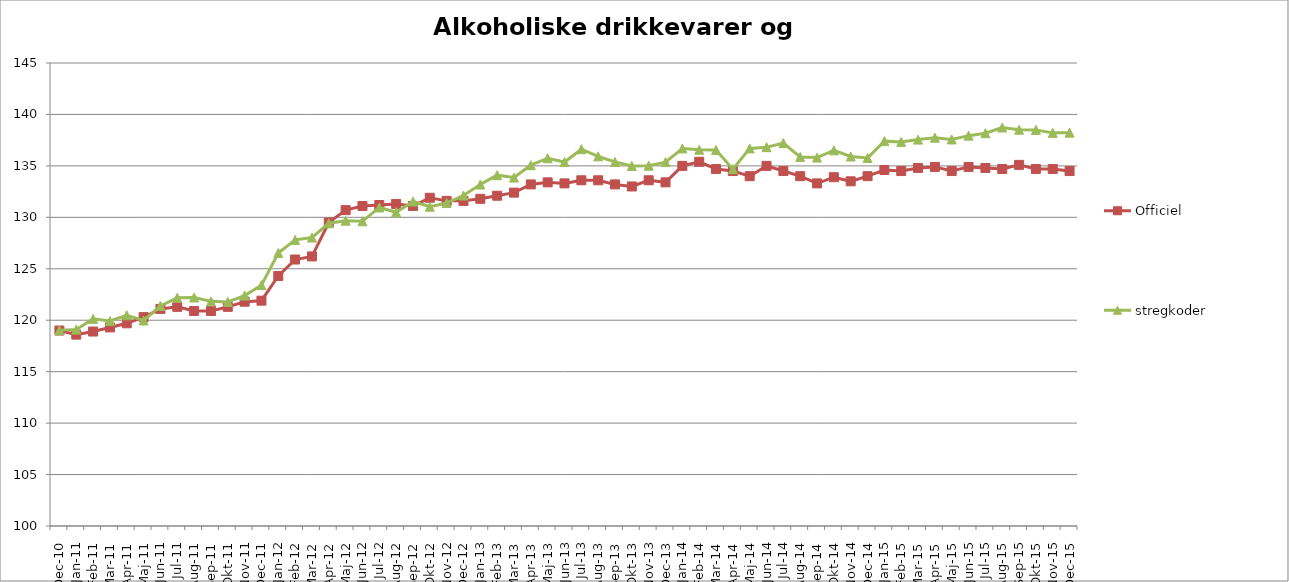
| Category | Officiel | stregkoder |
|---|---|---|
|  Dec-10 | 119 | 119.018 |
|  Jan-11 | 118.6 | 119.092 |
|  Feb-11 | 118.9 | 120.132 |
|  Mar-11 | 119.3 | 119.921 |
|  Apr-11 | 119.7 | 120.477 |
|  Maj-11 | 120.3 | 119.975 |
|  Jun-11 | 121.1 | 121.385 |
|  Jul-11 | 121.3 | 122.18 |
|  Aug-11 | 120.9 | 122.206 |
|  Sep-11 | 120.9 | 121.833 |
|  Okt-11 | 121.3 | 121.782 |
|  Nov-11 | 121.8 | 122.393 |
|  Dec-11 | 121.9 | 123.408 |
|  Jan-12 | 124.3 | 126.535 |
|  Feb-12 | 125.9 | 127.808 |
|  Mar-12 | 126.2 | 128.03 |
|  Apr-12 | 129.5 | 129.421 |
|  Maj-12 | 130.7 | 129.677 |
|  Jun-12 | 131.1 | 129.614 |
|  Jul-12 | 131.2 | 130.96 |
|  Aug-12 | 131.3 | 130.492 |
|  Sep-12 | 131.1 | 131.539 |
|  Okt-12 | 131.9 | 131.031 |
|  Nov-12 | 131.6 | 131.394 |
|  Dec-12 | 131.6 | 132.122 |
|  Jan-13 | 131.8 | 133.188 |
|  Feb-13 | 132.1 | 134.1 |
|  Mar-13 | 132.4 | 133.867 |
|  Apr-13 | 133.2 | 135.068 |
|  Maj-13 | 133.4 | 135.745 |
|  Jun-13 | 133.3 | 135.374 |
|  Jul-13 | 133.6 | 136.621 |
|  Aug-13 | 133.6 | 135.927 |
|  Sep-13 | 133.2 | 135.378 |
|  Okt-13 | 133 | 134.998 |
|  Nov-13 | 133.6 | 135.015 |
|  Dec-13 | 133.4 | 135.366 |
|  Jan-14 | 135 | 136.694 |
|  Feb-14 | 135.4 | 136.568 |
|  Mar-14 | 134.7 | 136.548 |
|  Apr-14 | 134.5 | 134.682 |
|  Maj-14 | 134 | 136.698 |
|  Jun-14 | 135 | 136.82 |
|  Jul-14 | 134.5 | 137.219 |
|  Aug-14 | 134 | 135.871 |
|  Sep-14 | 133.3 | 135.808 |
|  Okt-14 | 133.9 | 136.511 |
|  Nov-14 | 133.5 | 135.914 |
|  Dec-14 | 134 | 135.764 |
|  Jan-15 | 134.6 | 137.407 |
|  Feb-15 | 134.5 | 137.334 |
|  Mar-15 | 134.8 | 137.555 |
|  Apr-15 | 134.9 | 137.74 |
|  Maj-15 | 134.5 | 137.572 |
| Jun-15 | 134.9 | 137.939 |
| Jul-15 | 134.8 | 138.178 |
| Aug-15 | 134.7 | 138.731 |
| Sep-15 | 135.1 | 138.521 |
| Okt-15 | 134.7 | 138.495 |
| Nov-15 | 134.7 | 138.211 |
| Dec-15 | 134.499 | 138.233 |